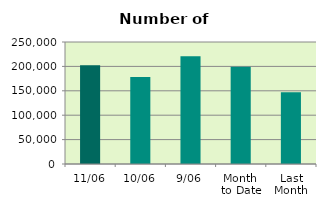
| Category | Series 0 |
|---|---|
| 11/06 | 202310 |
| 10/06 | 178294 |
| 9/06 | 220914 |
| Month 
to Date | 199385.778 |
| Last
Month | 147277.8 |